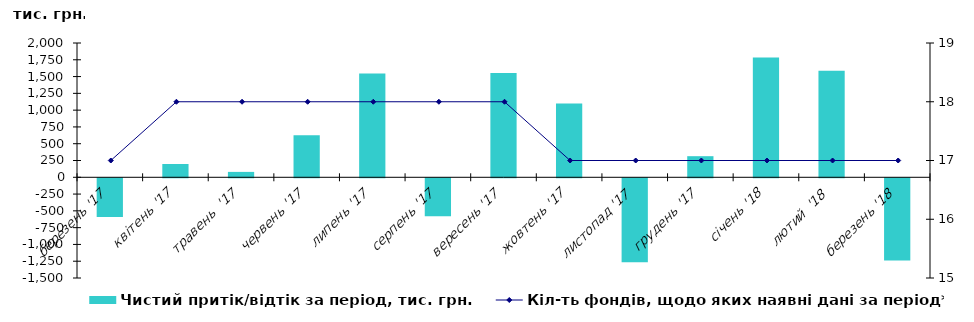
| Category | Чистий притік/відтік за період, тис. грн. |
|---|---|
| березень '17 | -576.733 |
| квітень '17 | 197.722 |
| травень  '17 | 80.282 |
| червень '17 | 625.568 |
| липень '17 | 1545.994 |
| серпень '17 | -564.222 |
| вересень '17 | 1554.716 |
| жовтень '17 | 1098.918 |
| листопад '17 | -1250.645 |
| грудень '17 | 314.249 |
| січень '18 | 1782.967 |
| лютий  '18 | 1586.636 |
| березень '18 | -1224.388 |